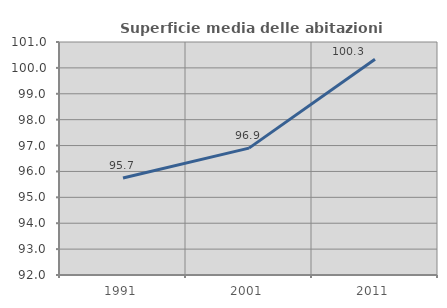
| Category | Superficie media delle abitazioni occupate |
|---|---|
| 1991.0 | 95.745 |
| 2001.0 | 96.901 |
| 2011.0 | 100.336 |